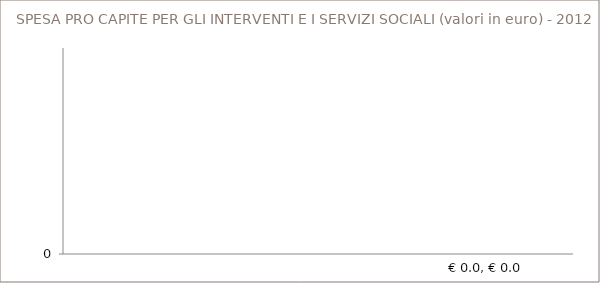
| Category | Spesa pro-capite dei Comuni per gli interventi e i servizi sociali |
|---|---|
| 0 | 0 |
| 1 | 0 |
| 2 | 0 |